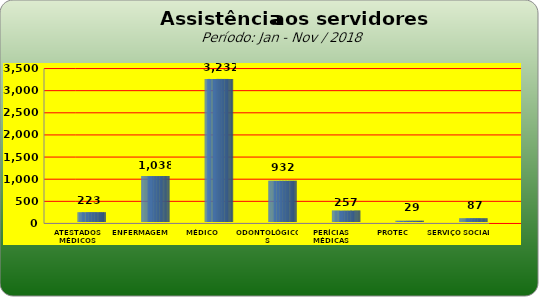
| Category | Series 0 |
|---|---|
| ATESTADOS MÉDICOS | 223 |
| ENFERMAGEM | 1038 |
| MÉDICO | 3232 |
| ODONTOLÓGICOS | 932 |
| PERÍCIAS MÉDICAS | 257 |
| PROTEC | 29 |
| SERVIÇO SOCIAL | 87 |